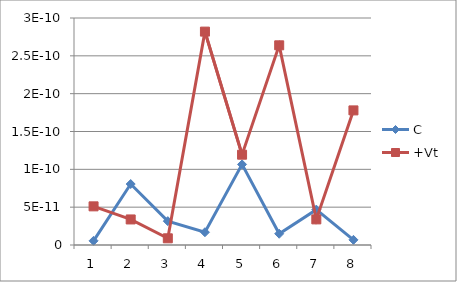
| Category | C | +Vt |
|---|---|---|
| 0 | 0 | 0 |
| 1 | 0 | 0 |
| 2 | 0 | 0 |
| 3 | 0 | 0 |
| 4 | 0 | 0 |
| 5 | 0 | 0 |
| 6 | 0 | 0 |
| 7 | 0 | 0 |